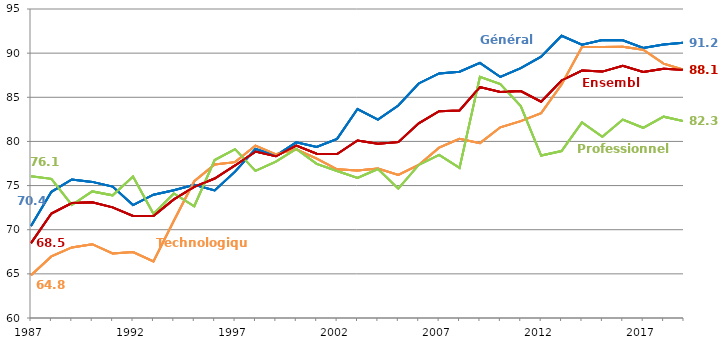
| Category | Générale | Technologique | Professionnelle | Ensemble |
|---|---|---|---|---|
| 1987 | 70.433 | 64.844 | 76.059 | 68.48 |
| 1988 | 74.298 | 66.976 | 75.76 | 71.83 |
| 1989 | 75.686 | 67.993 | 72.804 | 73.015 |
| 1990 | 75.417 | 68.361 | 74.338 | 73.116 |
| 1991 | 74.883 | 67.313 | 73.894 | 72.535 |
| 1992 | 72.793 | 67.472 | 76.012 | 71.558 |
| 1993 | 73.962 | 66.419 | 71.798 | 71.567 |
| 1994 | 74.472 | 71.015 | 74.102 | 73.436 |
| 1995 | 75.082 | 75.492 | 72.657 | 74.856 |
| 1996 | 74.45 | 77.383 | 77.895 | 75.798 |
| 1997 | 76.578 | 77.654 | 79.127 | 77.277 |
| 1998 | 79.164 | 79.529 | 76.669 | 78.851 |
| 1999 | 78.39 | 78.542 | 77.705 | 78.314 |
| 2000 | 79.897 | 79.116 | 79.147 | 79.53 |
| 2001 | 79.369 | 78.056 | 77.454 | 78.617 |
| 2002 | 80.297 | 76.838 | 76.645 | 78.57 |
| 2003 | 83.669 | 76.703 | 75.876 | 80.104 |
| 2004 | 82.477 | 76.92 | 76.873 | 79.725 |
| 2005 | 84.065 | 76.211 | 74.657 | 79.921 |
| 2006 | 86.566 | 77.333 | 77.333 | 82.056 |
| 2007 | 87.704 | 79.291 | 78.487 | 83.419 |
| 2008 | 87.9 | 80.3 | 77 | 83.5 |
| 2009 | 88.898 | 79.81 | 87.33 | 86.156 |
| 2010 | 87.3 | 81.6 | 86.5 | 85.6 |
| 2011 | 88.3 | 82.3 | 84 | 85.7 |
| 2012 | 89.6 | 83.2 | 78.4 | 84.5 |
| 2013 | 91.964 | 86.452 | 78.908 | 86.906 |
| 2014 | 90.953 | 90.702 | 82.162 | 88.031 |
| 2015 | 91.477 | 90.699 | 80.522 | 87.91 |
| 2016 | 91.452 | 90.724 | 82.48 | 88.575 |
| 2017 | 90.592 | 90.385 | 81.546 | 87.863 |
| 2018 | 90.979 | 88.808 | 82.806 | 88.233 |
| 2019p | 91.2 | 88.1 | 82.3 | 88.1 |